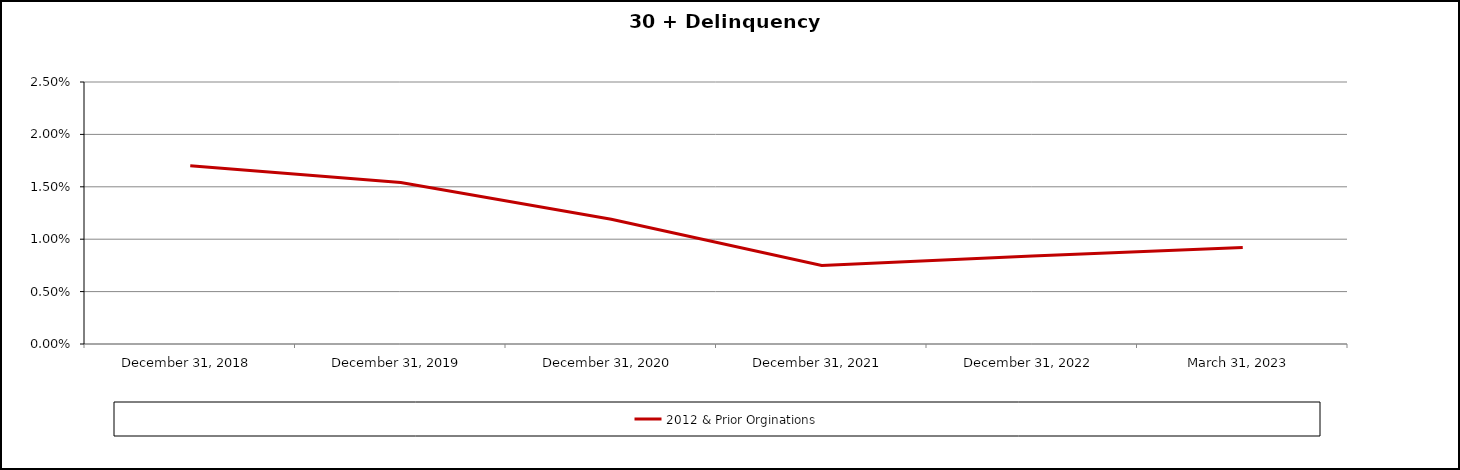
| Category | 2012 & Prior Orginations |
|---|---|
| 2018-12-31 | 0.017 |
| 2019-12-31 | 0.015 |
| 2020-12-31 | 0.012 |
| 2021-12-31 | 0.008 |
| 2022-12-31 | 0.008 |
| 2023-03-31 | 0.009 |